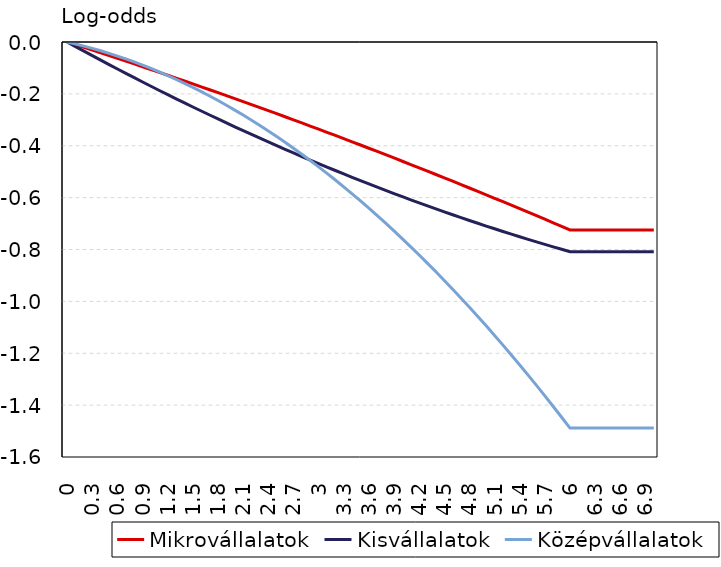
| Category | Mikrovállalatok | Kisvállalatok | Középvállalatok |
|---|---|---|---|
| 0.0 | 0 | 0 | 0 |
| 0.1 | -0.01 | -0.018 | -0.008 |
| 0.2 | -0.021 | -0.035 | -0.016 |
| 0.3 | -0.031 | -0.053 | -0.024 |
| 0.4 | -0.042 | -0.07 | -0.034 |
| 0.5 | -0.052 | -0.087 | -0.044 |
| 0.6 | -0.063 | -0.104 | -0.054 |
| 0.7 | -0.074 | -0.121 | -0.065 |
| 0.8 | -0.085 | -0.138 | -0.077 |
| 0.9 | -0.095 | -0.154 | -0.089 |
| 1.0 | -0.106 | -0.171 | -0.102 |
| 1.1 | -0.117 | -0.187 | -0.115 |
| 1.2 | -0.128 | -0.203 | -0.129 |
| 1.3 | -0.139 | -0.219 | -0.144 |
| 1.4 | -0.15 | -0.235 | -0.159 |
| 1.5 | -0.162 | -0.251 | -0.175 |
| 1.6 | -0.173 | -0.266 | -0.191 |
| 1.7 | -0.184 | -0.281 | -0.208 |
| 1.8 | -0.195 | -0.297 | -0.226 |
| 1.9 | -0.207 | -0.312 | -0.244 |
| 2.0 | -0.218 | -0.327 | -0.262 |
| 2.1 | -0.23 | -0.342 | -0.282 |
| 2.2 | -0.241 | -0.356 | -0.302 |
| 2.3 | -0.253 | -0.371 | -0.322 |
| 2.4 | -0.265 | -0.385 | -0.343 |
| 2.5 | -0.276 | -0.4 | -0.365 |
| 2.6 | -0.288 | -0.414 | -0.387 |
| 2.7 | -0.3 | -0.428 | -0.41 |
| 2.8 | -0.312 | -0.442 | -0.433 |
| 2.9 | -0.324 | -0.455 | -0.457 |
| 3.0 | -0.336 | -0.469 | -0.481 |
| 3.1 | -0.348 | -0.482 | -0.506 |
| 3.2 | -0.36 | -0.495 | -0.532 |
| 3.3 | -0.373 | -0.509 | -0.558 |
| 3.4 | -0.385 | -0.522 | -0.585 |
| 3.5 | -0.397 | -0.534 | -0.613 |
| 3.6 | -0.41 | -0.547 | -0.641 |
| 3.7 | -0.422 | -0.56 | -0.669 |
| 3.8 | -0.435 | -0.572 | -0.699 |
| 3.9 | -0.447 | -0.584 | -0.728 |
| 4.0 | -0.46 | -0.596 | -0.759 |
| 4.1 | -0.472 | -0.608 | -0.79 |
| 4.2 | -0.485 | -0.62 | -0.821 |
| 4.3 | -0.498 | -0.632 | -0.853 |
| 4.4 | -0.511 | -0.643 | -0.886 |
| 4.5 | -0.524 | -0.655 | -0.919 |
| 4.6 | -0.537 | -0.666 | -0.953 |
| 4.7 | -0.55 | -0.677 | -0.988 |
| 4.8 | -0.563 | -0.688 | -1.023 |
| 4.9 | -0.576 | -0.699 | -1.058 |
| 5.0 | -0.589 | -0.71 | -1.094 |
| 5.1 | -0.603 | -0.72 | -1.131 |
| 5.2 | -0.616 | -0.731 | -1.169 |
| 5.3 | -0.629 | -0.741 | -1.207 |
| 5.4 | -0.643 | -0.751 | -1.245 |
| 5.5 | -0.656 | -0.761 | -1.284 |
| 5.6 | -0.67 | -0.771 | -1.324 |
| 5.7 | -0.683 | -0.78 | -1.364 |
| 5.8 | -0.697 | -0.79 | -1.405 |
| 5.9 | -0.711 | -0.799 | -1.447 |
| 6.0 | -0.725 | -0.808 | -1.489 |
| 6.1 | -0.725 | -0.808 | -1.489 |
| 6.2 | -0.725 | -0.808 | -1.489 |
| 6.3 | -0.725 | -0.808 | -1.489 |
| 6.4 | -0.725 | -0.808 | -1.489 |
| 6.5 | -0.725 | -0.808 | -1.489 |
| 6.6 | -0.725 | -0.808 | -1.489 |
| 6.7 | -0.725 | -0.808 | -1.489 |
| 6.8 | -0.725 | -0.808 | -1.489 |
| 6.9 | -0.725 | -0.808 | -1.489 |
| 7.0 | -0.725 | -0.808 | -1.489 |